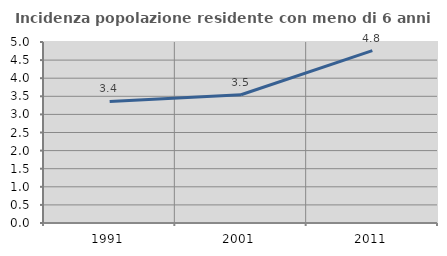
| Category | Incidenza popolazione residente con meno di 6 anni |
|---|---|
| 1991.0 | 3.358 |
| 2001.0 | 3.543 |
| 2011.0 | 4.762 |